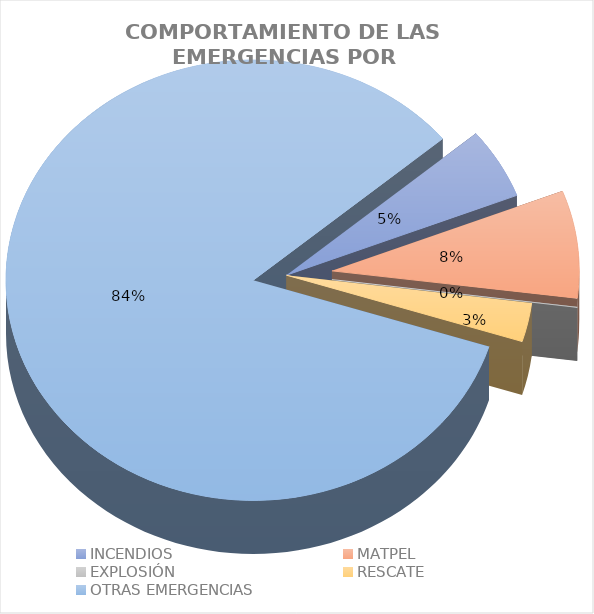
| Category | Incidentes |
|---|---|
| INCENDIOS | 0.052 |
| MATPEL | 0.079 |
| EXPLOSIÓN | 0 |
| RESCATE | 0.029 |
| OTRAS EMERGENCIAS | 0.84 |